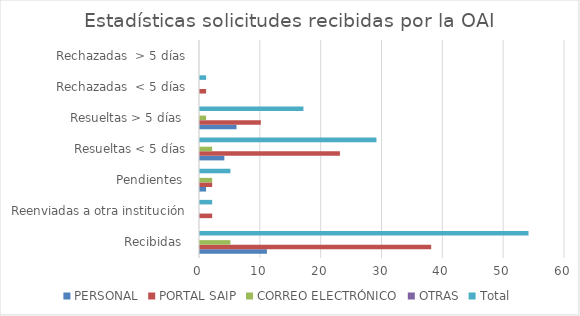
| Category | PERSONAL | PORTAL SAIP | CORREO ELECTRÓNICO | OTRAS | Total |
|---|---|---|---|---|---|
| Recibidas  | 11 | 38 | 5 | 0 | 54 |
| Reenviadas a otra institución | 0 | 2 | 0 | 0 | 2 |
| Pendientes  | 1 | 2 | 2 | 0 | 5 |
| Resueltas < 5 días | 4 | 23 | 2 | 0 | 29 |
| Resueltas > 5 días  | 6 | 10 | 1 | 0 | 17 |
| Rechazadas  < 5 días | 0 | 1 | 0 | 0 | 1 |
| Rechazadas  > 5 días | 0 | 0 | 0 | 0 | 0 |